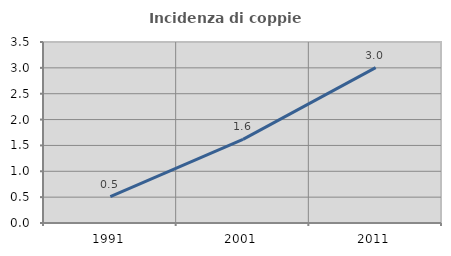
| Category | Incidenza di coppie miste |
|---|---|
| 1991.0 | 0.511 |
| 2001.0 | 1.617 |
| 2011.0 | 3.004 |